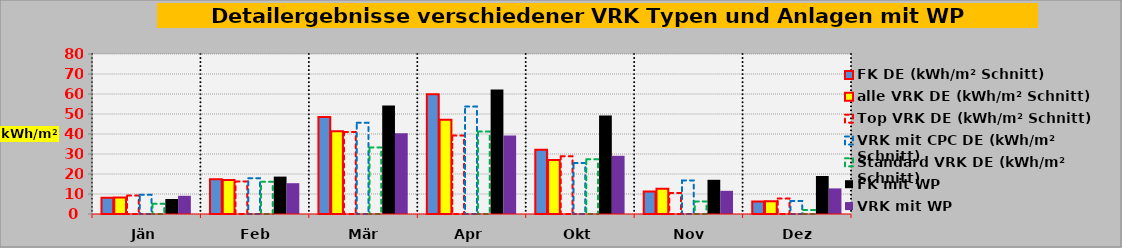
| Category | FK DE (kWh/m² Schnitt) | alle VRK DE (kWh/m² Schnitt) | - | Top VRK DE (kWh/m² Schnitt) | VRK mit CPC DE (kWh/m² Schnitt) | Standard VRK DE (kWh/m² Schnitt) | FK mit WP | VRK mit WP |
|---|---|---|---|---|---|---|---|---|
| Jän | 8.1 | 8.2 |  | 9.2 | 9.6 | 5.1 | 7.5 | 9.1 |
| Feb | 17.4 | 17 |  | 16.3 | 17.9 | 16.1 | 18.7 | 15.4 |
| Mär | 48.5 | 41.4 |  | 41 | 45.6 | 33.3 | 54.2 | 40.4 |
| Apr | 59.9 | 47.1 |  | 39.2 | 53.7 | 41.2 | 62.3 | 39.2 |
| Okt | 32.1 | 27 |  | 28.9 | 25.5 | 27.4 | 49.2 | 29.1 |
| Nov | 11.3 | 12.6 |  | 10.5 | 16.8 | 6.3 | 17.1 | 11.6 |
| Dez | 6.3 | 6.4 |  | 7.7 | 6.5 | 2 | 19 | 12.8 |